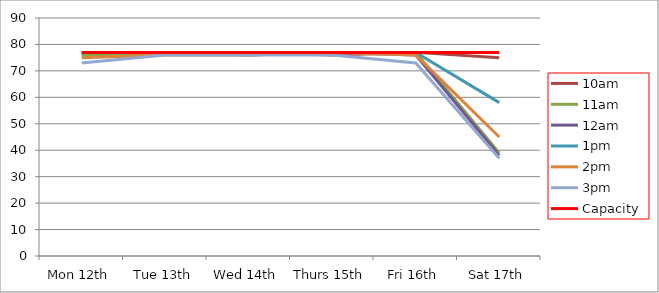
| Category | 9am | 10am | 11am | 12am | 1pm | 2pm | 3pm | 4pm | 5pm | Capacity |
|---|---|---|---|---|---|---|---|---|---|---|
| Mon 12th |  | 76 | 76 | 77 | 77 | 75 | 73 |  |  | 77 |
| Tue 13th |  | 77 | 77 | 77 | 77 | 76 | 76 |  |  | 77 |
| Wed 14th |  | 77 | 77 | 77 | 76 | 76 | 76 |  |  | 77 |
| Thurs 15th |  | 76 | 77 | 77 | 77 | 77 | 76 |  |  | 77 |
| Fri 16th |  | 77 | 77 | 76 | 77 | 76 | 73 |  |  | 77 |
| Sat 17th |  | 75 | 39 | 38 | 58 | 45 | 37 |  |  | 77 |